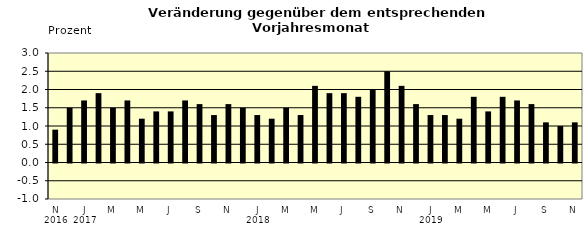
| Category | Series 0 |
|---|---|
| 0 | 0.9 |
| 1 | 1.5 |
| 2 | 1.7 |
| 3 | 1.9 |
| 4 | 1.5 |
| 5 | 1.7 |
| 6 | 1.2 |
| 7 | 1.4 |
| 8 | 1.4 |
| 9 | 1.7 |
| 10 | 1.6 |
| 11 | 1.3 |
| 12 | 1.6 |
| 13 | 1.5 |
| 14 | 1.3 |
| 15 | 1.2 |
| 16 | 1.5 |
| 17 | 1.3 |
| 18 | 2.1 |
| 19 | 1.9 |
| 20 | 1.9 |
| 21 | 1.8 |
| 22 | 2 |
| 23 | 2.5 |
| 24 | 2.1 |
| 25 | 1.6 |
| 26 | 1.3 |
| 27 | 1.3 |
| 28 | 1.2 |
| 29 | 1.8 |
| 30 | 1.4 |
| 31 | 1.8 |
| 32 | 1.7 |
| 33 | 1.6 |
| 34 | 1.1 |
| 35 | 1 |
| 36 | 1.1 |